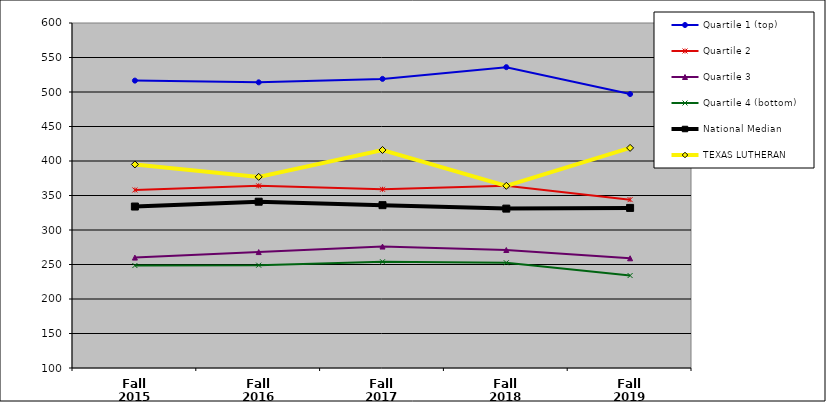
| Category | Quartile 1 (top) | Quartile 2 | Quartile 3 | Quartile 4 (bottom) | National Median | TEXAS LUTHERAN |
|---|---|---|---|---|---|---|
| Fall 2015 | 516.5 | 358 | 260 | 248.5 | 334 | 395 |
| Fall 2016 | 514 | 364 | 268 | 249 | 341 | 377 |
| Fall 2017 | 519 | 359 | 276 | 254 | 336 | 416 |
| Fall 2018 | 536 | 364 | 271 | 252.5 | 331 | 364 |
| Fall 2019 | 497 | 344 | 259 | 234 | 332 | 419 |